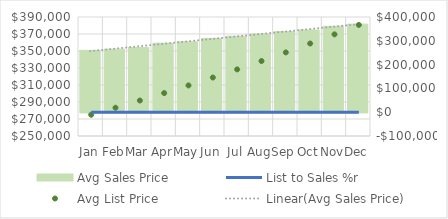
| Category | Avg Sales Price |
|---|---|
| Jan | 259875 |
| Feb | 264838.75 |
| Mar | 272000 |
| Apr | 290000 |
| May | 295604.851 |
| Jun | 310000 |
| Jul | 319300 |
| Aug | 328879 |
| Sep | 338745.37 |
| Oct | 345319.605 |
| Nov | 361000 |
| Dec | 370000 |